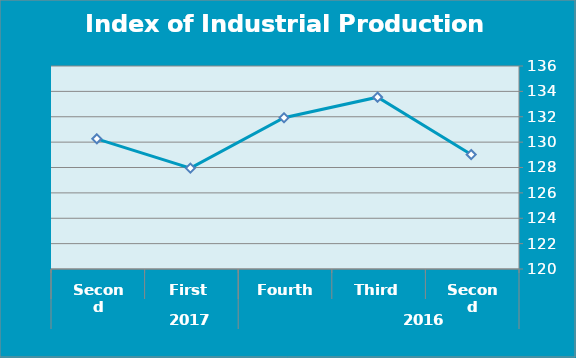
| Category | Series 0 |
|---|---|
| 0 | 129.02 |
| 1 | 133.54 |
| 2 | 131.92 |
| 3 | 127.95 |
| 4 | 130.26 |